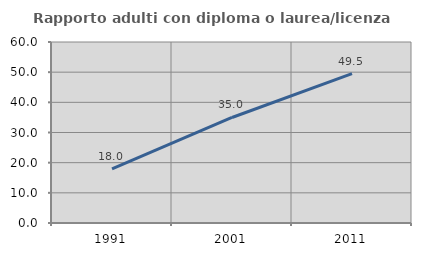
| Category | Rapporto adulti con diploma o laurea/licenza media  |
|---|---|
| 1991.0 | 17.978 |
| 2001.0 | 34.981 |
| 2011.0 | 49.508 |